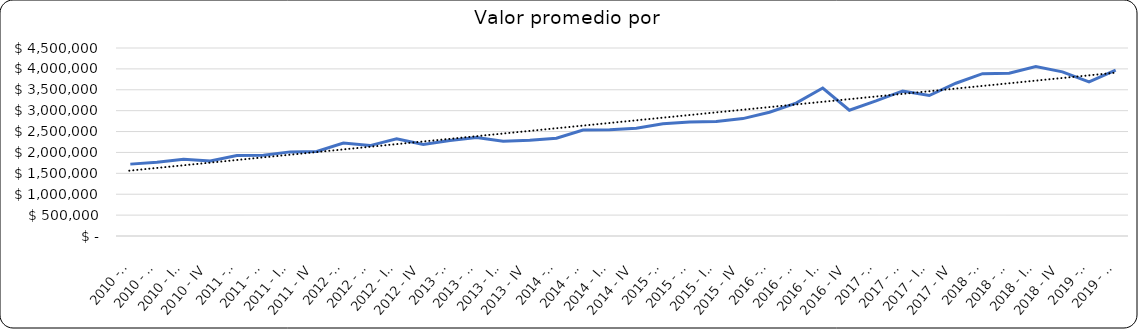
| Category | Valor m2 en Bogotá por sectores |
|---|---|
| 2010 - I | 1720430.108 |
| 2010 - II | 1763440.86 |
| 2010 - III | 1836021.505 |
| 2010 - IV | 1795698.925 |
| 2011 - I | 1927419.355 |
| 2011 - II | 1932795.699 |
| 2011 - III | 2013440.86 |
| 2011 - IV | 2024193.548 |
| 2012 - I | 2225806.452 |
| 2012 - II | 2163978.495 |
| 2012 - III | 2327956.989 |
| 2012 - IV | 2190860.215 |
| 2013 - I | 2284946.237 |
| 2013 - II | 2354838.71 |
| 2013 - III | 2266129.032 |
| 2013 - IV | 2291002.984 |
| 2014 - I | 2341397.849 |
| 2014 - II | 2534946.237 |
| 2014 - III | 2543010.753 |
| 2014 - IV | 2580645.161 |
| 2015 - I | 2686781.609 |
| 2015 - II | 2729885.057 |
| 2015 - III | 2742787.356 |
| 2015 - IV | 2810344.828 |
| 2016 - I | 2961748.634 |
| 2016 - II | 3179487.179 |
| 2016 - III | 3541666.667 |
| 2016 - IV | 3010928.962 |
| 2017 - I | 3233333.333 |
| 2017 - II | 3472222.222 |
| 2017 - III | 3363000.173 |
| 2017 - IV | 3656250 |
| 2018 - I | 3886111.111 |
| 2018 - II | 3898305.085 |
| 2018 - III | 4058736 |
| 2018 - IV | 3928724 |
| 2019 - I | 3688525 |
| 2019 - II | 3968254 |